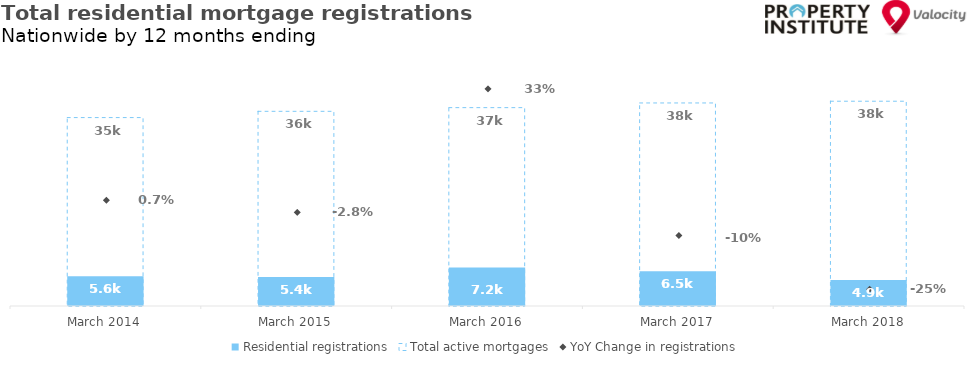
| Category | Residential registrations | Total active mortgages |
|---|---|---|
| 2014-03-01 | 5558 | 35185 |
| 2015-03-01 | 5402 | 36351 |
| 2016-03-01 | 7187 | 37040 |
| 2017-03-01 | 6502 | 37912 |
| 2018-03-01 | 4869 | 38236 |